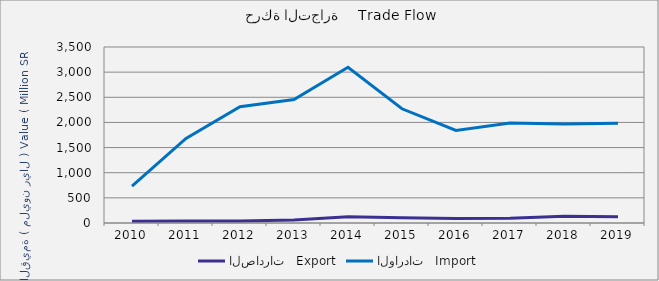
| Category | الصادرات   Export | الواردات   Import |
|---|---|---|
| 2010.0 | 33076492 | 733086668 |
| 2011.0 | 38413509 | 1682372784 |
| 2012.0 | 38683513 | 2311903518 |
| 2013.0 | 57383230 | 2454383721 |
| 2014.0 | 124360867 | 3095665556 |
| 2015.0 | 103469891 | 2270946349 |
| 2016.0 | 89131733 | 1841772179 |
| 2017.0 | 96292360 | 1986562515 |
| 2018.0 | 135167970 | 1969222881 |
| 2019.0 | 126379624 | 1984487383 |